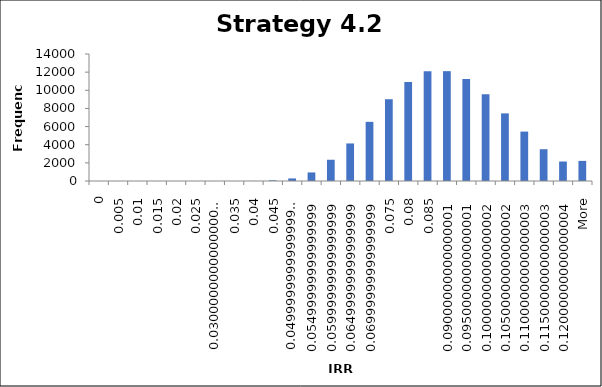
| Category | Frequency |
|---|---|
| 0 | 0 |
| 0.005 | 0 |
| 0.01 | 0 |
| 0.015 | 0 |
| 0.02 | 2 |
| 0.025 | 0 |
| 0.03 | 1 |
| 0.035 | 1 |
| 0.04 | 7 |
| 0.045 | 73 |
| 0.05 | 283 |
| 0.055 | 943 |
| 0.06 | 2342 |
| 0.065 | 4140 |
| 0.07 | 6522 |
| 0.075 | 9015 |
| 0.08 | 10903 |
| 0.085 | 12090 |
| 0.09 | 12108 |
| 0.095 | 11252 |
| 0.1 | 9551 |
| 0.105 | 7454 |
| 0.11 | 5446 |
| 0.115 | 3505 |
| 0.12 | 2147 |
| More | 2217 |